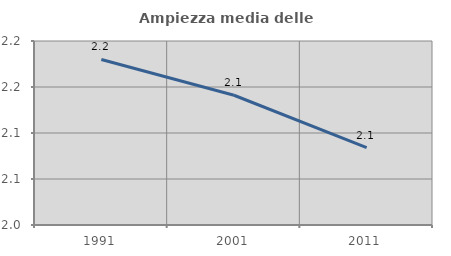
| Category | Ampiezza media delle famiglie |
|---|---|
| 1991.0 | 2.18 |
| 2001.0 | 2.141 |
| 2011.0 | 2.084 |